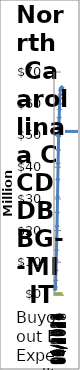
| Category | Projected Expenditures | Actual Expenditure |
|---|---|---|
| 04/2022 | 1475000 | 0 |
| 07/2022 | 2225000 | 0 |
| 10/2022 | 4285000 | 0 |
| 01/2023 | 7467700 | 0 |
| 04/2023 | 10650400 | 0 |
| 07/2023 | 13833100 | 0 |
| 10/2023 | 17546250 | 0 |
| 01/2024 | 21370794.5 | 0 |
| 04/2024 | 25741702.5 | 0 |
| 07/2024 | 30658974 | 0 |
| 10/2024 | 36122609 | 0 |
| 01/2025 | 41187398.645 | 0 |
| 04/2025 | 45408056.682 | 0 |
| 07/2025 | 49628714.72 | 0 |
| 10/2025 | 53005241.15 | 0 |
| 01/2026 | 55613607.817 | 0 |
| 04/2026 | 58221974.484 | 0 |
| 07/2026 | 59960885.596 | 0 |
| 10/2026 | 61699796.707 | 0 |
| 01/2027 | 62893849.004 | 0 |
| 04/2027 | 64087901.3 | 0 |
| 07/2027 | 64386414.374 | 0 |
| 10/2027 | 64625224.834 | 0 |
| 01/2028 | 64864035.293 | 0 |
| 04/2028 | 64983440.523 | 0 |
| 07/2028 | 65117399.752 | 0 |